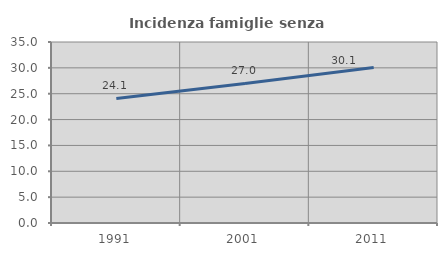
| Category | Incidenza famiglie senza nuclei |
|---|---|
| 1991.0 | 24.083 |
| 2001.0 | 26.991 |
| 2011.0 | 30.07 |